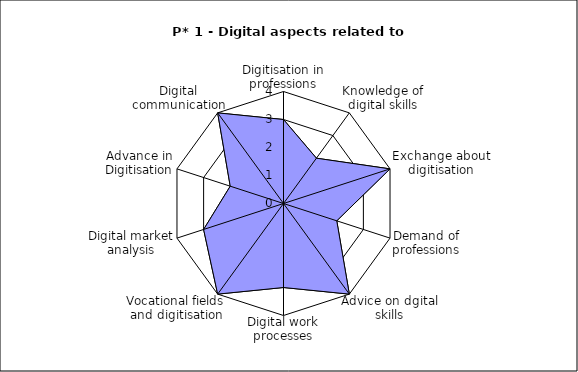
| Category | Series 1 | Series 0 |
|---|---|---|
| Digitisation in professions | 3 | 3 |
| Knowledge of digital skills | 2 | 2 |
| Exchange about digitisation | 4 | 4 |
| Demand of professions | 2 | 2 |
| Advice on dgital skills | 4 | 4 |
| Digital work processes | 3 | 3 |
| Vocational fields and digitisation | 4 | 4 |
| Digital market analysis | 3 | 3 |
| Advance in Digitisation | 2 | 2 |
| Digital communication | 4 | 4 |